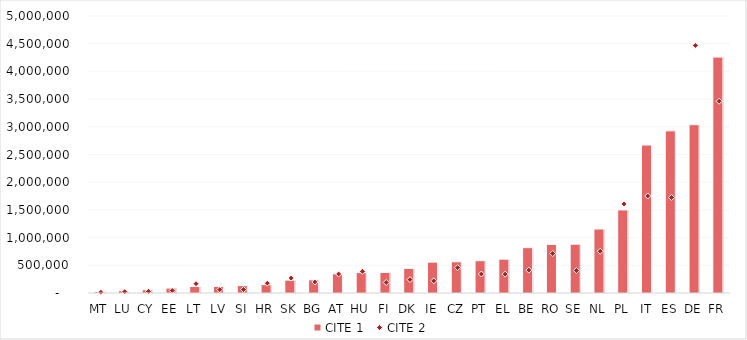
| Category | CITE 1 |
|---|---|
| MT | 26941 |
| LU | 40579 |
| CY | 58543 |
| EE | 88992 |
| LT | 116682 |
| LV | 119274 |
| SI | 133342 |
| HR | 151652 |
| SK | 232330 |
| BG | 237737 |
| AT | 346611 |
| HU | 367591 |
| FI | 371364 |
| DK | 443943 |
| IE | 557157 |
| CZ | 563645 |
| PT | 583173 |
| EL | 610718 |
| BE | 818422 |
| RO | 876906 |
| SE | 880822 |
| NL | 1154994 |
| PL | 1499410 |
| IT | 2671011 |
| ES | 2926681 |
| DE | 3038181 |
| FR | 4258764 |